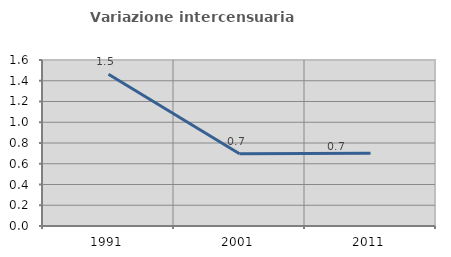
| Category | Variazione intercensuaria annua |
|---|---|
| 1991.0 | 1.462 |
| 2001.0 | 0.696 |
| 2011.0 | 0.701 |